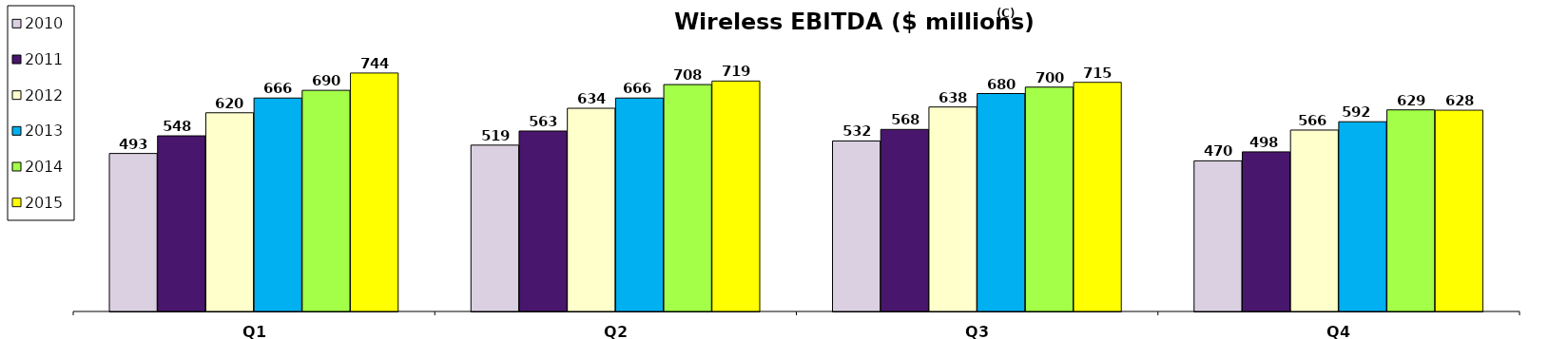
| Category | 2010 | 2011 | 2012 | 2013 | 2014 | 2015 |
|---|---|---|---|---|---|---|
| Q1 | 493 | 548 | 620 | 666 | 690 | 744 |
| Q2 | 519 | 563 | 634 | 666 | 708 | 719 |
| Q3 | 532 | 568 | 638 | 680 | 700 | 715 |
| Q4 | 470 | 498 | 566 | 592 | 629 | 628 |